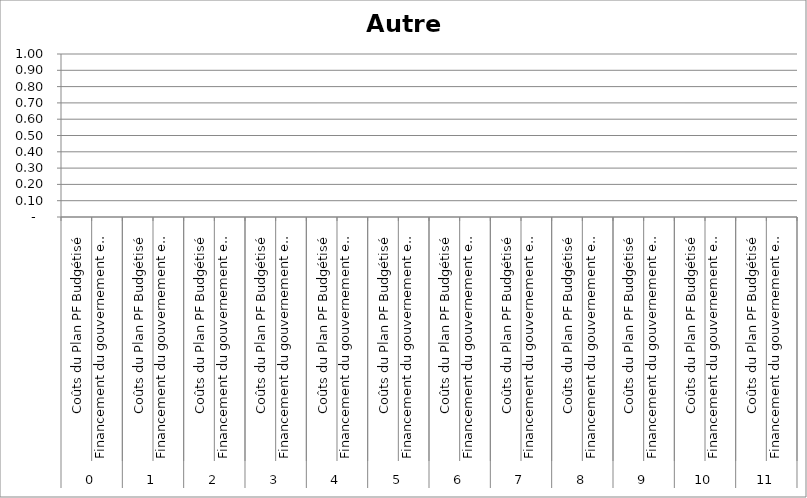
| Category | Autre 5 |
|---|---|
| 0 | 0 |
| 1 | 0 |
| 2 | 0 |
| 3 | 0 |
| 4 | 0 |
| 5 | 0 |
| 6 | 0 |
| 7 | 0 |
| 8 | 0 |
| 9 | 0 |
| 10 | 0 |
| 11 | 0 |
| 12 | 0 |
| 13 | 0 |
| 14 | 0 |
| 15 | 0 |
| 16 | 0 |
| 17 | 0 |
| 18 | 0 |
| 19 | 0 |
| 20 | 0 |
| 21 | 0 |
| 22 | 0 |
| 23 | 0 |